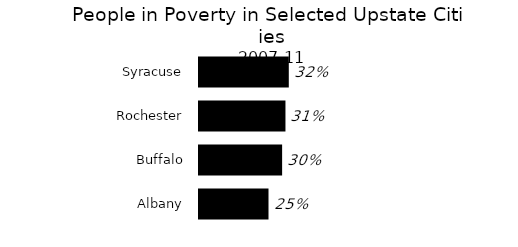
| Category | Series 0 |
|---|---|
| Albany | 0.25 |
| Buffalo | 0.299 |
| Rochester | 0.311 |
| Syracuse | 0.323 |